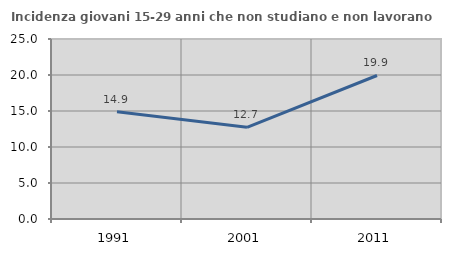
| Category | Incidenza giovani 15-29 anni che non studiano e non lavorano  |
|---|---|
| 1991.0 | 14.902 |
| 2001.0 | 12.727 |
| 2011.0 | 19.932 |